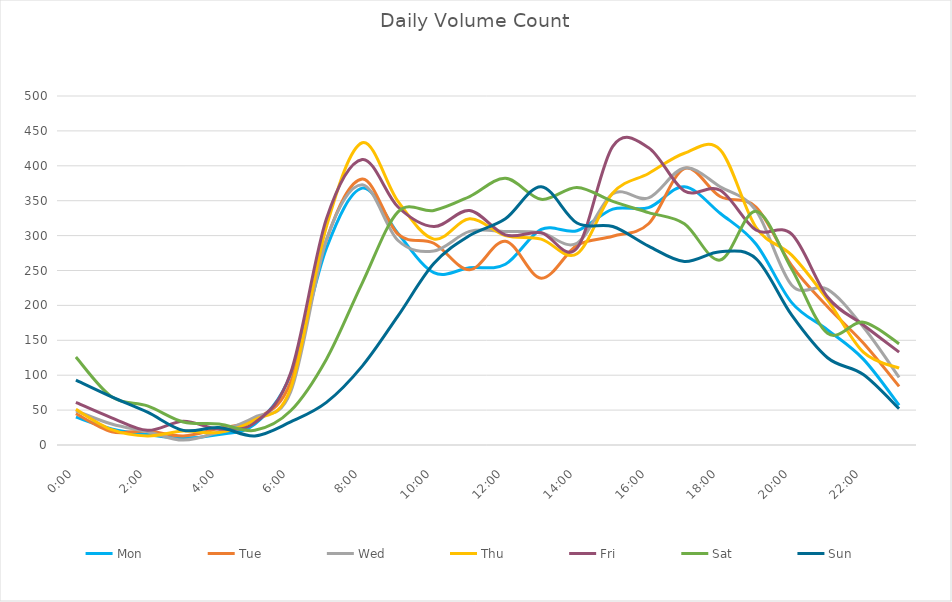
| Category | Mon | Tue | Wed | Thu | Fri | Sat | Sun |
|---|---|---|---|---|---|---|---|
| 0.0 | 40 | 45 | 49 | 51 | 61 | 126 | 93 |
| 0.0416666666666667 | 23 | 19 | 30 | 22 | 39 | 69 | 69 |
| 0.0833333333333333 | 15 | 20 | 19 | 13 | 21 | 56 | 47 |
| 0.125 | 10 | 13 | 7 | 20 | 34 | 33 | 21 |
| 0.166666666666667 | 15 | 24 | 19 | 18 | 23 | 30 | 25 |
| 0.208333333333333 | 30 | 37 | 40 | 36 | 32 | 21 | 13 |
| 0.25 | 101 | 90 | 76 | 81 | 103 | 49 | 33 |
| 0.291666666666667 | 282 | 294 | 294 | 313 | 324 | 123 | 61 |
| 0.333333333333333 | 368 | 381 | 373 | 433 | 409 | 232 | 113 |
| 0.375 | 303 | 302 | 293 | 349 | 341 | 334 | 185 |
| 0.416666666666667 | 247 | 289 | 278 | 295 | 313 | 336 | 260 |
| 0.4583333333333333 | 254 | 251 | 306 | 324 | 336 | 356 | 300 |
| 0.5 | 259 | 292 | 306 | 300 | 301 | 382 | 324 |
| 0.541666666666667 | 309 | 239 | 304 | 295 | 304 | 352 | 370 |
| 0.5833333333333334 | 307 | 286 | 289 | 274 | 282 | 369 | 318 |
| 0.625 | 338 | 299 | 360 | 361 | 428 | 349 | 313 |
| 0.666666666666667 | 340 | 317 | 354 | 389 | 426 | 333 | 285 |
| 0.7083333333333334 | 370 | 396 | 397 | 418 | 364 | 317 | 263 |
| 0.75 | 332 | 356 | 370 | 423 | 365 | 265 | 277 |
| 0.791666666666667 | 288 | 341 | 336 | 312 | 308 | 335 | 267 |
| 0.8333333333333334 | 204 | 257 | 229 | 272 | 302 | 252 | 186 |
| 0.875 | 165 | 198 | 223 | 208 | 212 | 160 | 125 |
| 0.916666666666667 | 123 | 146 | 169 | 133 | 172 | 176 | 101 |
| 0.9583333333333334 | 57 | 84 | 97 | 110 | 133 | 145 | 52 |